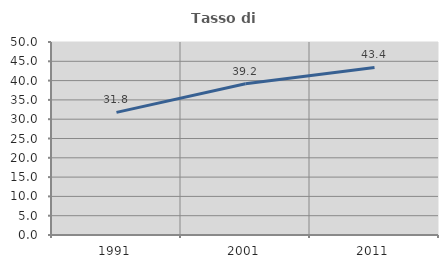
| Category | Tasso di occupazione   |
|---|---|
| 1991.0 | 31.776 |
| 2001.0 | 39.175 |
| 2011.0 | 43.415 |